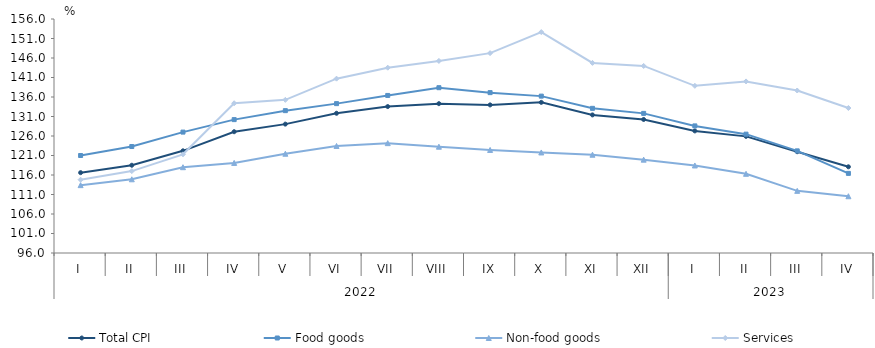
| Category | Total CPI | Food goods | Non-food goods | Services |
|---|---|---|---|---|
| 0 | 116.6 | 121 | 113.4 | 114.8 |
| 1 | 118.5 | 123.3 | 114.9 | 117 |
| 2 | 122.2 | 127 | 118 | 121.3 |
| 3 | 127.1 | 130.2 | 119.1 | 134.4 |
| 4 | 129.047 | 132.5 | 121.45 | 135.267 |
| 5 | 131.827 | 134.301 | 123.443 | 140.701 |
| 6 | 133.547 | 136.399 | 124.168 | 143.511 |
| 7 | 134.294 | 138.387 | 123.256 | 145.253 |
| 8 | 133.971 | 137.121 | 122.424 | 147.248 |
| 9 | 134.625 | 136.226 | 121.779 | 152.646 |
| 10 | 131.406 | 133.093 | 121.201 | 144.742 |
| 11 | 130.241 | 131.801 | 119.936 | 143.965 |
| 12 | 127.307 | 128.59 | 118.441 | 138.865 |
| 13 | 125.905 | 126.472 | 116.307 | 139.99 |
| 14 | 121.977 | 122.19 | 111.932 | 137.666 |
| 15 | 118.102 | 116.414 | 110.554 | 133.178 |